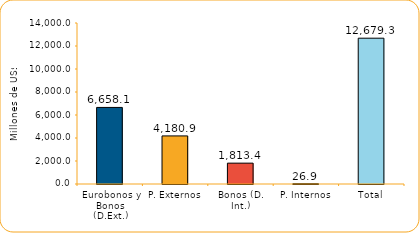
| Category | Series 1 |
|---|---|
| Eurobonos y Bonos (D.Ext.) | 6658.1 |
| P. Externos | 4180.9 |
| Bonos (D. Int.) | 1813.4 |
| P. Internos | 26.9 |
| Total | 12679.3 |